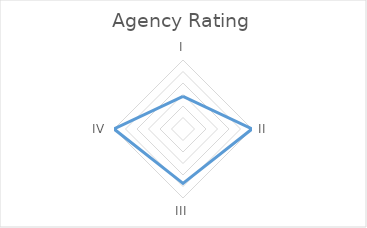
| Category | Series 0 |
|---|---|
| I | 1.417 |
| II | 3 |
| III | 2.364 |
| IV | 3 |